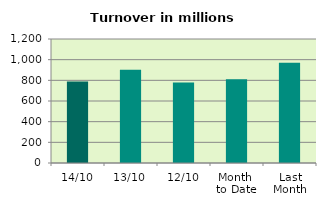
| Category | Series 0 |
|---|---|
| 14/10 | 788.262 |
| 13/10 | 903.152 |
| 12/10 | 779.772 |
| Month 
to Date | 811.219 |
| Last
Month | 970.98 |